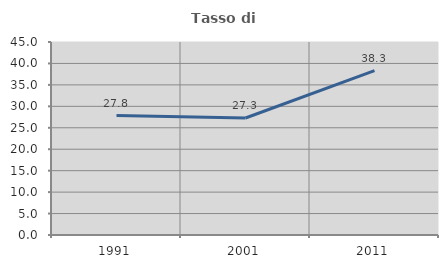
| Category | Tasso di occupazione   |
|---|---|
| 1991.0 | 27.839 |
| 2001.0 | 27.273 |
| 2011.0 | 38.318 |